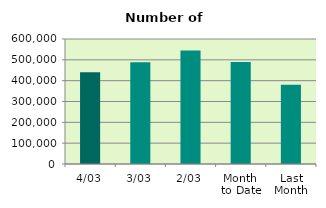
| Category | Series 0 |
|---|---|
| 4/03 | 440424 |
| 3/03 | 488058 |
| 2/03 | 544868 |
| Month 
to Date | 489346 |
| Last
Month | 380345.4 |